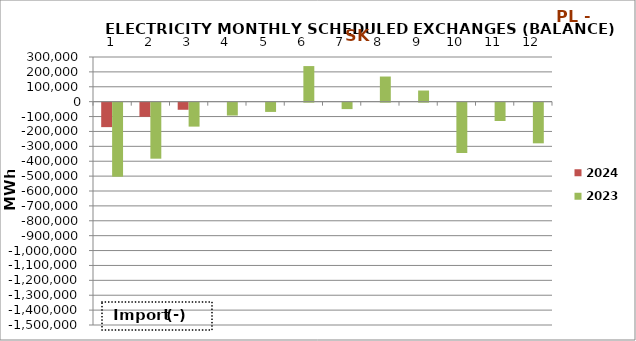
| Category | 2024 | 2023 |
|---|---|---|
| 0 | -164316.8 | -497249.3 |
| 1 | -94983.2 | -376275.2 |
| 2 | -47696.1 | -160843.3 |
| 3 | 0 | -86467.3 |
| 4 | 0 | -62161.3 |
| 5 | 0 | 239002.6 |
| 6 | 0 | -43237.1 |
| 7 | 0 | 168802 |
| 8 | 0 | 74825.5 |
| 9 | 0 | -338067 |
| 10 | 0 | -123245.4 |
| 11 | 0 | -273058.9 |